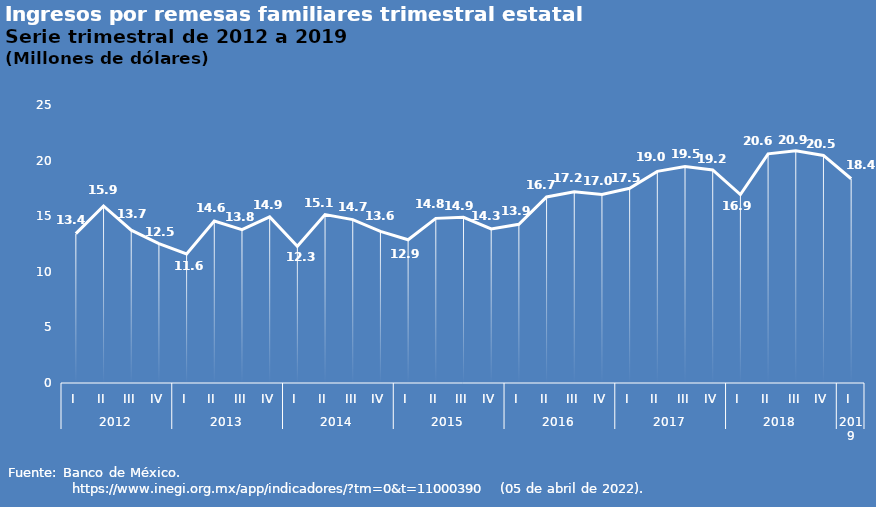
| Category | Series 0 |
|---|---|
| 0 | 13.428 |
| 1 | 15.919 |
| 2 | 13.741 |
| 3 | 12.532 |
| 4 | 11.612 |
| 5 | 14.561 |
| 6 | 13.789 |
| 7 | 14.938 |
| 8 | 12.298 |
| 9 | 15.144 |
| 10 | 14.691 |
| 11 | 13.634 |
| 12 | 12.883 |
| 13 | 14.804 |
| 14 | 14.904 |
| 15 | 13.854 |
| 16 | 14.274 |
| 17 | 16.726 |
| 18 | 17.189 |
| 19 | 16.955 |
| 20 | 17.511 |
| 21 | 19.031 |
| 22 | 19.463 |
| 23 | 19.164 |
| 24 | 16.949 |
| 25 | 20.604 |
| 26 | 20.876 |
| 27 | 20.462 |
| 28 | 18.367 |